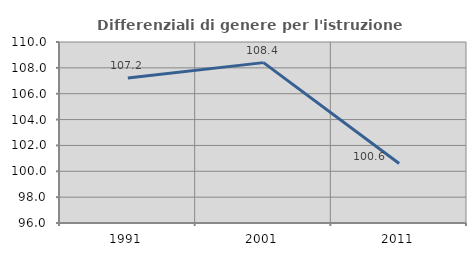
| Category | Differenziali di genere per l'istruzione superiore |
|---|---|
| 1991.0 | 107.222 |
| 2001.0 | 108.404 |
| 2011.0 | 100.603 |